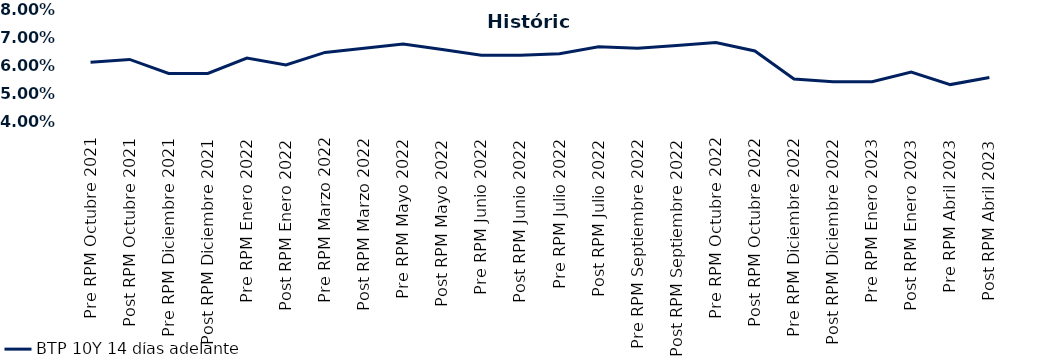
| Category | BTP 10Y 14 días adelante |
|---|---|
| Pre RPM Octubre 2021 | 0.061 |
| Post RPM Octubre 2021 | 0.062 |
| Pre RPM Diciembre 2021 | 0.057 |
| Post RPM Diciembre 2021 | 0.057 |
| Pre RPM Enero 2022 | 0.062 |
| Post RPM Enero 2022 | 0.06 |
| Pre RPM Marzo 2022 | 0.064 |
| Post RPM Marzo 2022 | 0.066 |
| Pre RPM Mayo 2022 | 0.068 |
| Post RPM Mayo 2022 | 0.066 |
| Pre RPM Junio 2022 | 0.064 |
| Post RPM Junio 2022 | 0.064 |
| Pre RPM Julio 2022 | 0.064 |
| Post RPM Julio 2022 | 0.066 |
| Pre RPM Septiembre 2022 | 0.066 |
| Post RPM Septiembre 2022 | 0.067 |
| Pre RPM Octubre 2022 | 0.068 |
| Post RPM Octubre 2022 | 0.065 |
| Pre RPM Diciembre 2022 | 0.055 |
| Post RPM Diciembre 2022 | 0.054 |
| Pre RPM Enero 2023 | 0.054 |
| Post RPM Enero 2023 | 0.058 |
| Pre RPM Abril 2023 | 0.053 |
| Post RPM Abril 2023 | 0.056 |